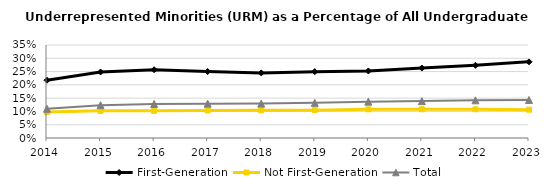
| Category | First-Generation | Not First-Generation | Total |
|---|---|---|---|
| 2014.0 | 0.217 | 0.098 | 0.11 |
| 2015.0 | 0.249 | 0.102 | 0.123 |
| 2016.0 | 0.257 | 0.102 | 0.128 |
| 2017.0 | 0.25 | 0.103 | 0.129 |
| 2018.0 | 0.245 | 0.104 | 0.129 |
| 2019.0 | 0.25 | 0.105 | 0.132 |
| 2020.0 | 0.252 | 0.108 | 0.137 |
| 2021.0 | 0.263 | 0.108 | 0.139 |
| 2022.0 | 0.274 | 0.108 | 0.142 |
| 2023.0 | 0.287 | 0.106 | 0.143 |